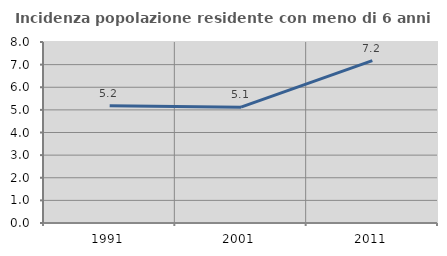
| Category | Incidenza popolazione residente con meno di 6 anni |
|---|---|
| 1991.0 | 5.177 |
| 2001.0 | 5.121 |
| 2011.0 | 7.173 |